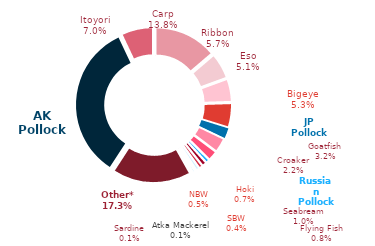
| Category | 2023 |
|---|---|
| AK Pollock | 75954 |
| Itoyori | 15761.407 |
| Carp | 30947.655 |
| Ribbon | 12751.623 |
| Eso | 11354.626 |
| Pac Whiting | 0 |
| Bigeye | 11959.728 |
| JP Pollock | 5143.514 |
| Goatfish | 7131.46 |
| Croaker | 4914.53 |
| Russian Pollock | 1873.307 |
| Seabream | 2239.815 |
| Flying Fish | 1860.648 |
| Hoki | 1678.2 |
| SBW | 806.8 |
| NBW | 1080.035 |
| Atka Mackerel | 174.867 |
| Sardine | 216 |
| Other* | 38868.558 |